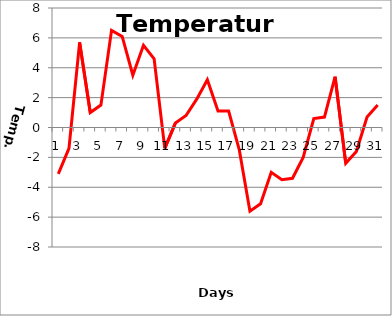
| Category | Series 0 |
|---|---|
| 0 | -3.1 |
| 1 | -1.4 |
| 2 | 5.7 |
| 3 | 1 |
| 4 | 1.5 |
| 5 | 6.5 |
| 6 | 6.1 |
| 7 | 3.5 |
| 8 | 5.5 |
| 9 | 4.6 |
| 10 | -1.4 |
| 11 | 0.3 |
| 12 | 0.8 |
| 13 | 1.9 |
| 14 | 3.2 |
| 15 | 1.1 |
| 16 | 1.1 |
| 17 | -1.5 |
| 18 | -5.6 |
| 19 | -5.1 |
| 20 | -3 |
| 21 | -3.5 |
| 22 | -3.4 |
| 23 | -2 |
| 24 | 0.6 |
| 25 | 0.7 |
| 26 | 3.4 |
| 27 | -2.4 |
| 28 | -1.6 |
| 29 | 0.7 |
| 30 | 1.5 |